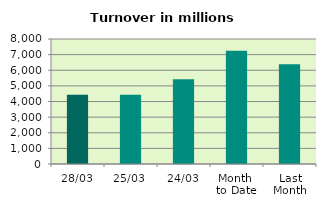
| Category | Series 0 |
|---|---|
| 28/03 | 4434.381 |
| 25/03 | 4439.723 |
| 24/03 | 5418.36 |
| Month 
to Date | 7248.33 |
| Last
Month | 6378.947 |